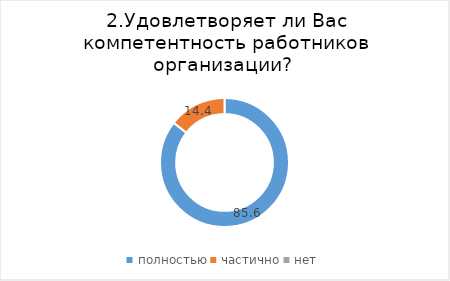
| Category | Series 0 |
|---|---|
| полностью | 85.556 |
| частично | 14.444 |
| нет | 0 |